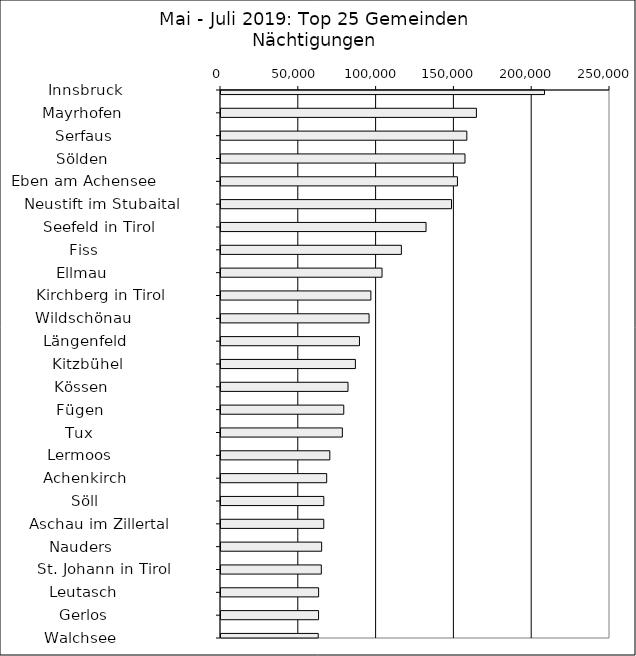
| Category | Series 0 |
|---|---|
|   Innsbruck                  | 207910 |
|   Mayrhofen                  | 164145 |
|   Serfaus                    | 157989 |
|   Sölden                     | 156810 |
|   Eben am Achensee           | 151962 |
|   Neustift im Stubaital      | 148143 |
|   Seefeld in Tirol           | 131776 |
|   Fiss                       | 115932 |
|   Ellmau                     | 103499 |
|   Kirchberg in Tirol         | 96317 |
|   Wildschönau                | 95160 |
|   Längenfeld                 | 88994 |
|   Kitzbühel                  | 86367 |
|   Kössen                     | 81620 |
|   Fügen                      | 78901 |
|   Tux                        | 78002 |
|   Lermoos                    | 69944 |
|   Achenkirch                 | 67931 |
|   Söll                       | 66070 |
|   Aschau im Zillertal        | 66043 |
|   Nauders                    | 64689 |
|   St. Johann in Tirol        | 64472 |
|   Leutasch                   | 62732 |
|   Gerlos                     | 62705 |
|   Walchsee                   | 62497 |